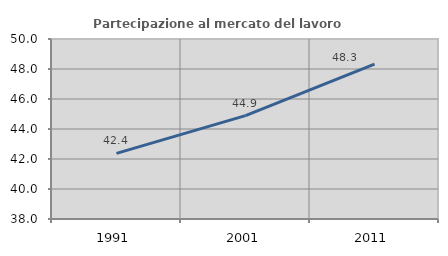
| Category | Partecipazione al mercato del lavoro  femminile |
|---|---|
| 1991.0 | 42.372 |
| 2001.0 | 44.89 |
| 2011.0 | 48.326 |